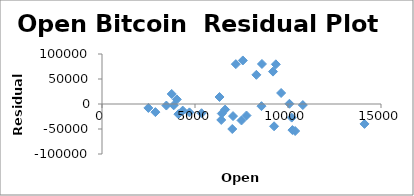
| Category | Series 0 |
|---|---|
| 2492.600098 | -7855.429 |
| 2871.300049 | -16259.04 |
| 4701.759766 | -16758.745 |
| 4341.049805 | -13162.571 |
| 6440.970215 | -19075.601 |
| 10198.599609 | -27215.053 |
| 14112.200195 | -39829.378 |
| 10237.299805 | -52130.255 |
| 10385.0 | -54049.963 |
| 7003.060059 | -50014.529 |
| 9251.469727 | -44568.722 |
| 7500.700195 | -32912.767 |
| 6411.680176 | -31935.377 |
| 7769.040039 | -23019.907 |
| 7044.810059 | -24205.286 |
| 6619.850098 | -11161.74 |
| 6318.140137 | 14008.719 |
| 4024.464355 | 9225.466 |
| 3746.713379 | 20077.787 |
| 3460.547119 | -3073.487 |
| 3853.75708 | -2644.004 |
| 4105.362305 | -20305.206 |
| 5350.914551 | -18456.562 |
| 8573.839844 | -4339.878 |
| 10796.930664 | -2123.269 |
| 10077.442383 | 460.904 |
| 9630.592773 | 22019.394 |
| 8299.720703 | 58336.961 |
| 9193.992188 | 64790.97 |
| 7571.616211 | 87078.95 |
| 7194.89209 | 79696.315 |
| 9346.357422 | 79349.137 |
| 8599.758789 | 80052.164 |